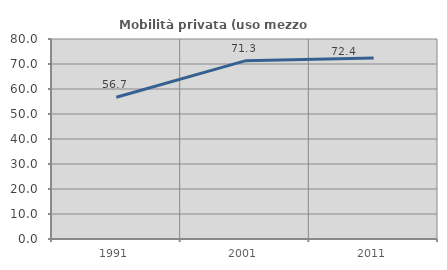
| Category | Mobilità privata (uso mezzo privato) |
|---|---|
| 1991.0 | 56.688 |
| 2001.0 | 71.257 |
| 2011.0 | 72.395 |